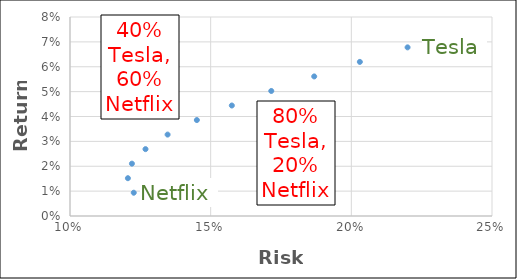
| Category | risk |
|---|---|
| 0.12266126489964 | 0.009 |
| 0.12058040251839089 | 0.015 |
| 0.12201254425459797 | 0.021 |
| 0.12683874943694773 | 0.027 |
| 0.13469467577169833 | 0.033 |
| 0.14508901723777234 | 0.039 |
| 0.1575200624811576 | 0.044 |
| 0.17154561248944414 | 0.05 |
| 0.18680686326780077 | 0.056 |
| 0.20302534591226934 | 0.062 |
| 0.2199894495672553 | 0.068 |